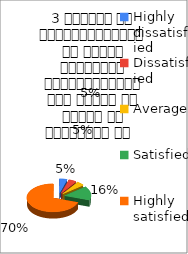
| Category | 3 शिक्षक का विद्यार्थियों के प्रति व्यव्हार मित्रतापूर्ण एवं सहयोग के भावना से परिपूर्ण था   |
|---|---|
| Highly dissatisfied | 3 |
| Dissatisfied | 3 |
| Average | 3 |
| Satisfied | 10 |
| Highly satisfied | 44 |